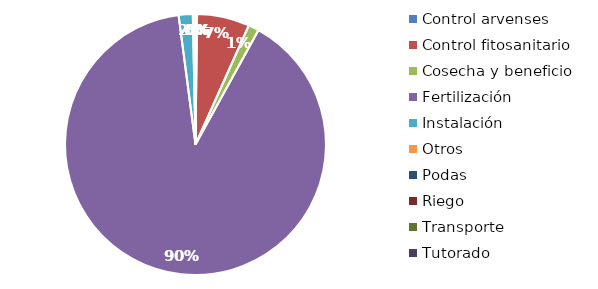
| Category | Valor |
|---|---|
| Control arvenses | 512580 |
| Control fitosanitario | 17118236 |
| Cosecha y beneficio | 3441383.596 |
| Fertilización | 236596821 |
| Instalación | 4592182.27 |
| Otros | 867216 |
| Podas | 0 |
| Riego | 0 |
| Transporte | 0 |
| Tutorado | 0 |